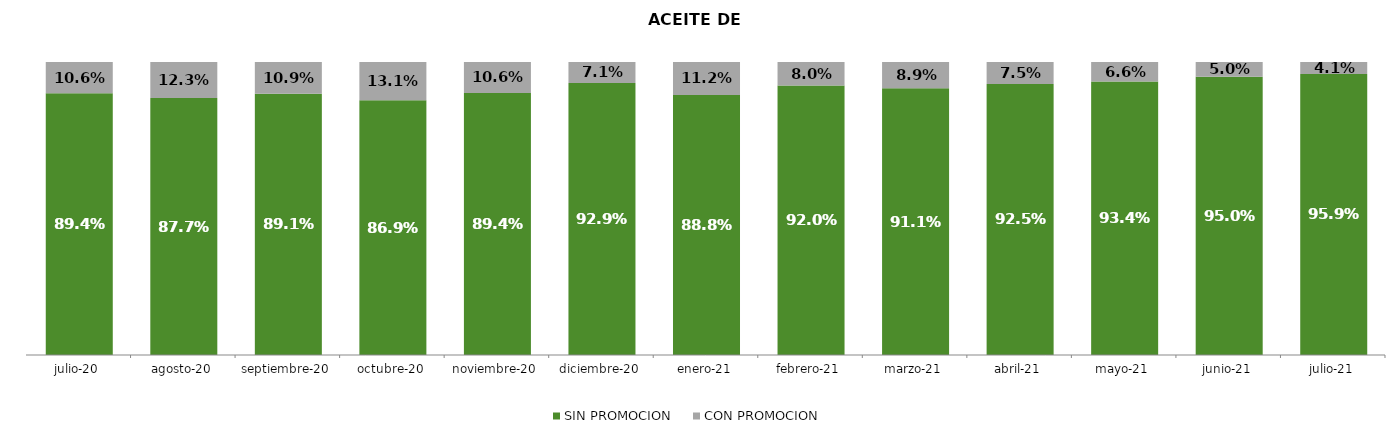
| Category | SIN PROMOCION   | CON PROMOCION   |
|---|---|---|
| 2020-07-01 | 0.894 | 0.106 |
| 2020-08-01 | 0.877 | 0.123 |
| 2020-09-01 | 0.891 | 0.109 |
| 2020-10-01 | 0.869 | 0.131 |
| 2020-11-01 | 0.894 | 0.106 |
| 2020-12-01 | 0.929 | 0.071 |
| 2021-01-01 | 0.888 | 0.112 |
| 2021-02-01 | 0.92 | 0.08 |
| 2021-03-01 | 0.911 | 0.089 |
| 2021-04-01 | 0.925 | 0.075 |
| 2021-05-01 | 0.934 | 0.066 |
| 2021-06-01 | 0.95 | 0.05 |
| 2021-07-01 | 0.959 | 0.041 |